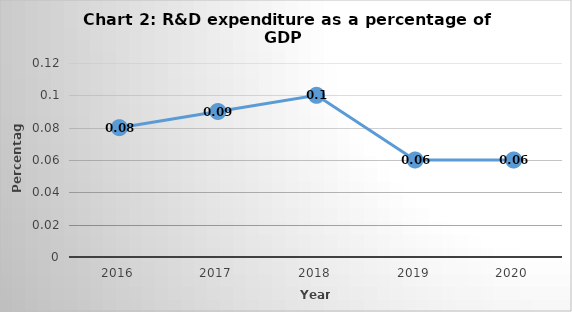
| Category | Series 0 |
|---|---|
| 2016.0 | 0.08 |
| 2017.0 | 0.09 |
| 2018.0 | 0.1 |
| 2019.0 | 0.06 |
| 2020.0 | 0.06 |